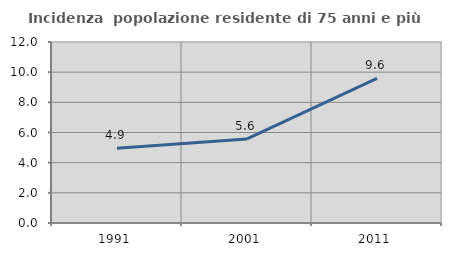
| Category | Incidenza  popolazione residente di 75 anni e più |
|---|---|
| 1991.0 | 4.949 |
| 2001.0 | 5.574 |
| 2011.0 | 9.589 |